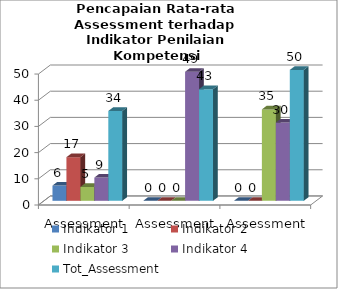
| Category | Indikator 1 | Indikator 2 | Indikator 3 | Indikator 4 | Tot_Assessment |
|---|---|---|---|---|---|
| Assessment 1 | 5.824 | 16.647 | 5.294 | 8.882 | 34.297 |
| Assessment 2 | 0 | 0 | 0 | 49.266 | 42.608 |
| Assessment 3 | 0 | 0 | 34.897 | 29.893 | 49.973 |